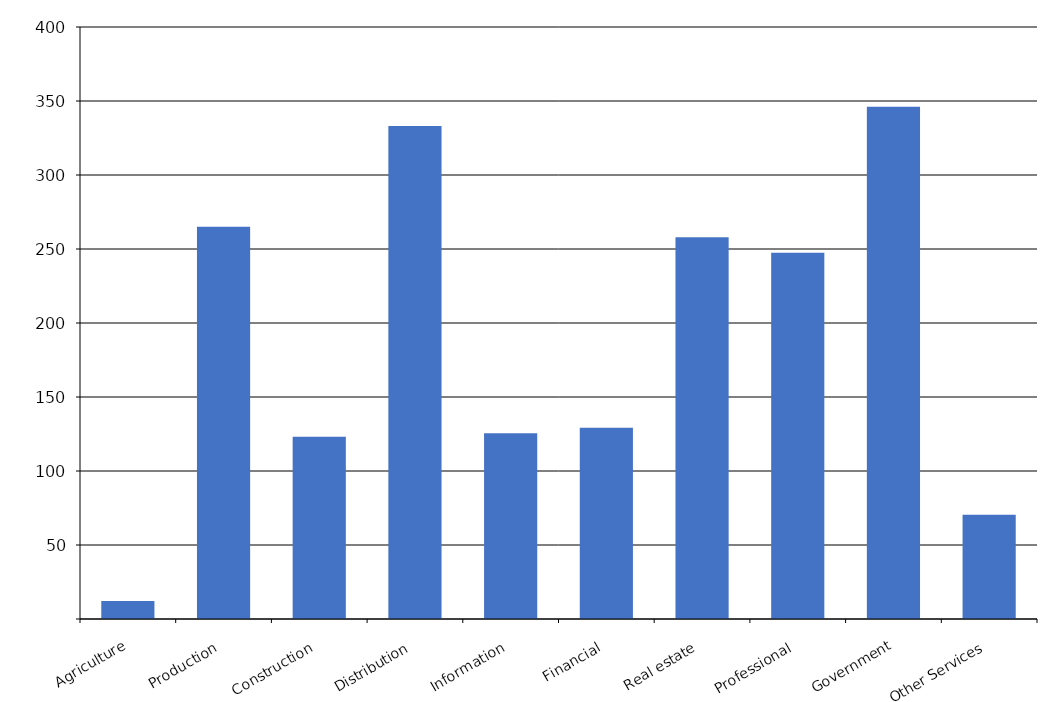
| Category | Series 0 |
|---|---|
| Agriculture | 12185 |
| Production | 264991 |
| Construction | 123199 |
| Distribution | 333048 |
| Information | 125518 |
| Financial | 129267 |
| Real estate | 257891 |
| Professional | 247523 |
| Government | 346121 |
| Other Services | 70504 |